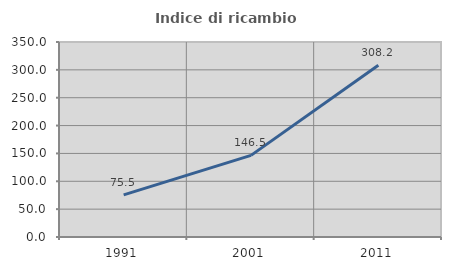
| Category | Indice di ricambio occupazionale  |
|---|---|
| 1991.0 | 75.51 |
| 2001.0 | 146.512 |
| 2011.0 | 308.197 |